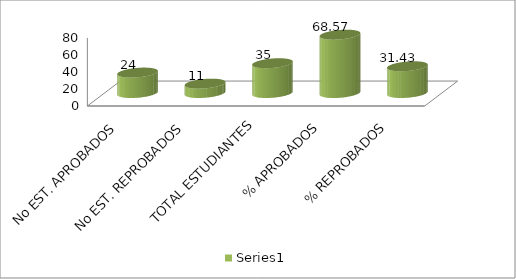
| Category | Series 0 |
|---|---|
| No EST. APROBADOS | 24 |
| No EST. REPROBADOS | 11 |
| TOTAL ESTUDIANTES | 35 |
| % APROBADOS | 68.571 |
| % REPROBADOS | 31.429 |